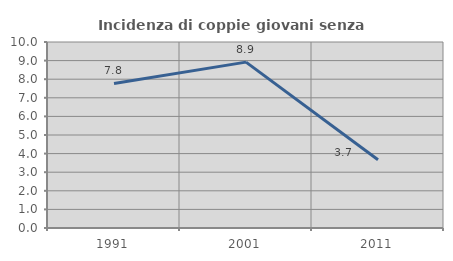
| Category | Incidenza di coppie giovani senza figli |
|---|---|
| 1991.0 | 7.773 |
| 2001.0 | 8.918 |
| 2011.0 | 3.672 |